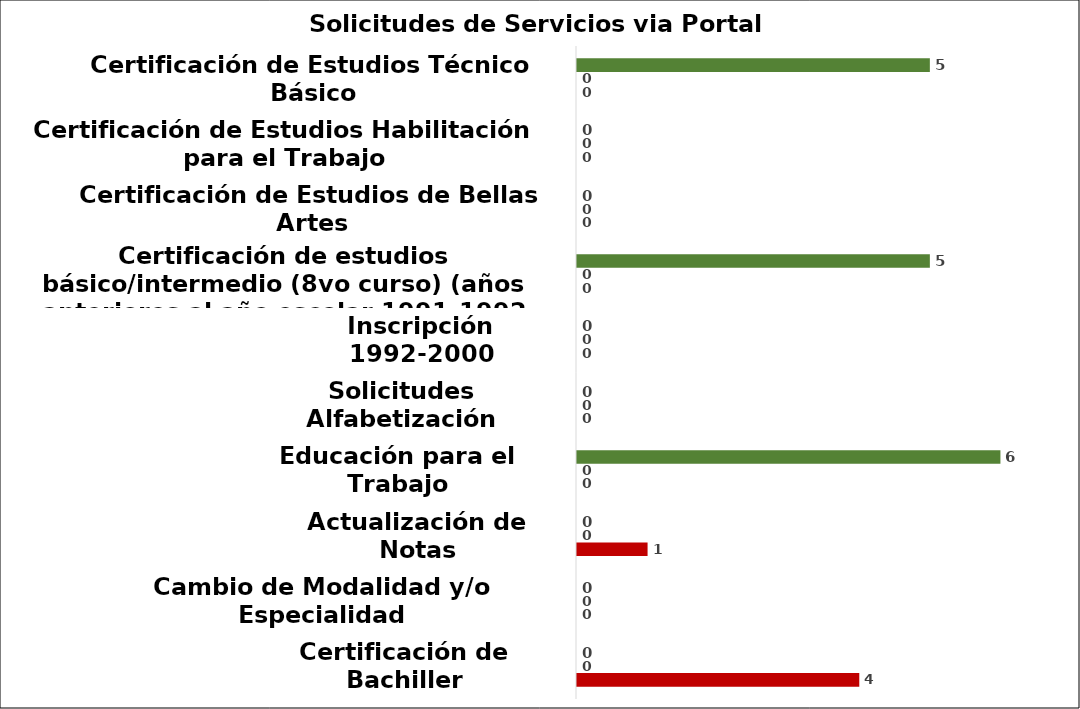
| Category | Series 4 | Series 6 | Series 8 |
|---|---|---|---|
| Certificación de Bachiller | 4 | 0 | 0 |
| Cambio de Modalidad y/o Especialidad | 0 | 0 | 0 |
| Actualización de Notas | 1 | 0 | 0 |
| Educación para el Trabajo | 0 | 0 | 6 |
| Solicitudes Alfabetización | 0 | 0 | 0 |
| Inscripción 1992-2000 | 0 | 0 | 0 |
| Certificación de estudios básico/intermedio (8vo curso) (años anteriores al año escolar 1991-1992 antes de las Pruebas Nacionales) | 0 | 0 | 5 |
| Certificación de Estudios de Bellas Artes | 0 | 0 | 0 |
| Certificación de Estudios Habilitación para el Trabajo | 0 | 0 | 0 |
| Certificación de Estudios Técnico Básico | 0 | 0 | 5 |